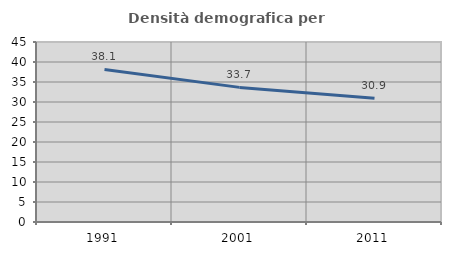
| Category | Densità demografica |
|---|---|
| 1991.0 | 38.128 |
| 2001.0 | 33.654 |
| 2011.0 | 30.922 |